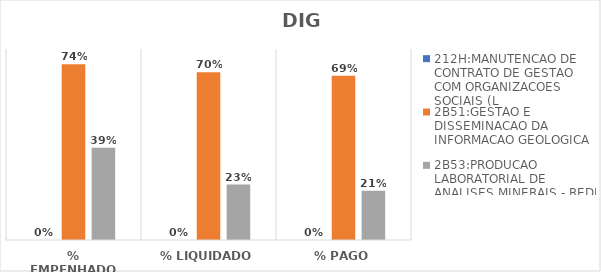
| Category | 212H:MANUTENCAO DE CONTRATO DE GESTAO COM ORGANIZACOES SOCIAIS (L | 2B51:GESTAO E DISSEMINACAO DA INFORMACAO GEOLOGICA | 2B53:PRODUCAO LABORATORIAL DE ANALISES MINERAIS - REDE LAMIN |
|---|---|---|---|
| % EMPENHADO | 0 | 0.736 | 0.387 |
| % LIQUIDADO | 0 | 0.703 | 0.232 |
| % PAGO | 0 | 0.688 | 0.206 |